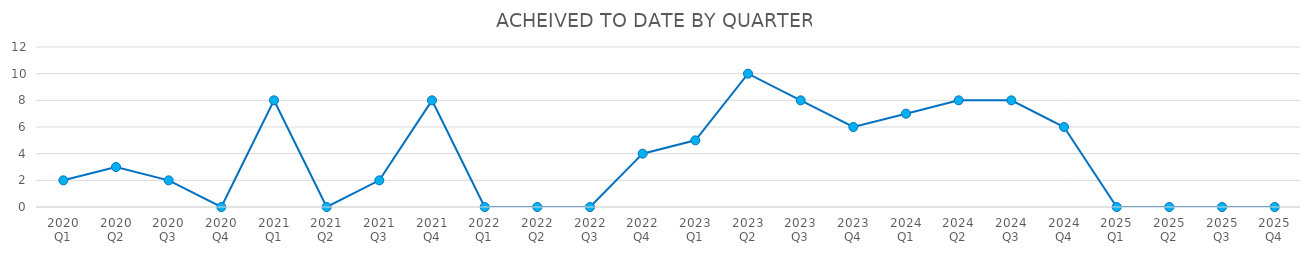
| Category | ACHIEVED TO DATE |
|---|---|
| 2020 Q1 | 2 |
| 2020 Q2 | 3 |
| 2020 Q3 | 2 |
| 2020 Q4 | 0 |
| 2021 Q1 | 8 |
| 2021 Q2 | 0 |
| 2021 Q3 | 2 |
| 2021 Q4 | 8 |
| 2022 Q1 | 0 |
| 2022 Q2 | 0 |
| 2022 Q3 | 0 |
| 2022 Q4 | 4 |
| 2023 Q1 | 5 |
| 2023 Q2 | 10 |
| 2023 Q3 | 8 |
| 2023 Q4 | 6 |
| 2024 Q1 | 7 |
| 2024 Q2 | 8 |
| 2024 Q3 | 8 |
| 2024 Q4 | 6 |
| 2025 Q1 | 0 |
| 2025 Q2 | 0 |
| 2025 Q3 | 0 |
| 2025 Q4 | 0 |